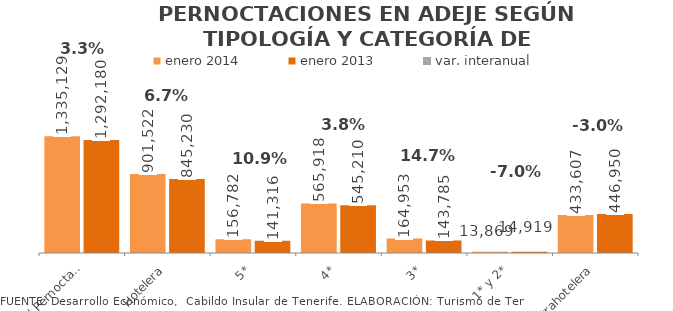
| Category | enero 2014 | enero 2013 |
|---|---|---|
| Total Pernoctaciones | 1335129 | 1292180 |
| Hotelera | 901522 | 845230 |
| 5* | 156782 | 141316 |
| 4* | 565918 | 545210 |
| 3* | 164953 | 143785 |
| 1* y 2* | 13869 | 14919 |
| Extrahotelera | 433607 | 446950 |